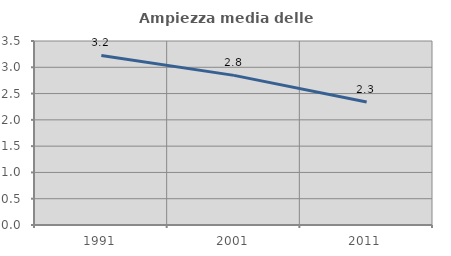
| Category | Ampiezza media delle famiglie |
|---|---|
| 1991.0 | 3.226 |
| 2001.0 | 2.846 |
| 2011.0 | 2.34 |